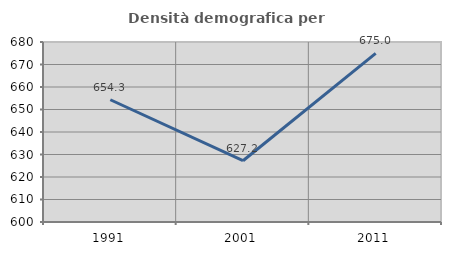
| Category | Densità demografica |
|---|---|
| 1991.0 | 654.332 |
| 2001.0 | 627.229 |
| 2011.0 | 674.957 |